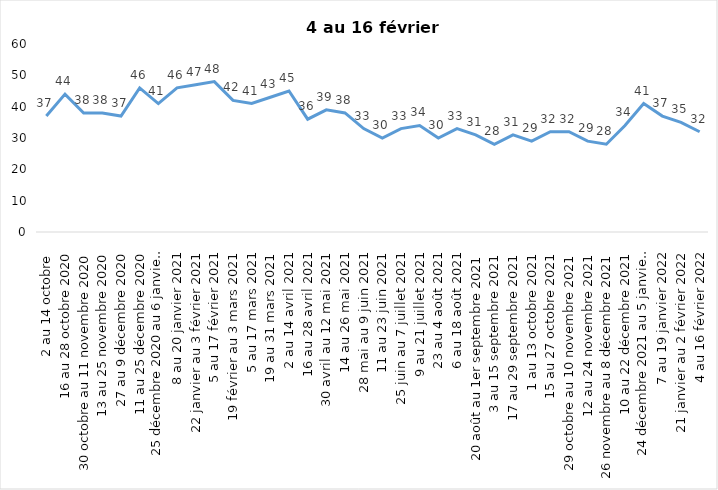
| Category | Toujours aux trois mesures |
|---|---|
| 2 au 14 octobre  | 37 |
| 16 au 28 octobre 2020 | 44 |
| 30 octobre au 11 novembre 2020 | 38 |
| 13 au 25 novembre 2020 | 38 |
| 27 au 9 décembre 2020 | 37 |
| 11 au 25 décembre 2020 | 46 |
| 25 décembre 2020 au 6 janvier 2021 | 41 |
| 8 au 20 janvier 2021 | 46 |
| 22 janvier au 3 février 2021 | 47 |
| 5 au 17 février 2021 | 48 |
| 19 février au 3 mars 2021 | 42 |
| 5 au 17 mars 2021 | 41 |
| 19 au 31 mars 2021 | 43 |
| 2 au 14 avril 2021 | 45 |
| 16 au 28 avril 2021 | 36 |
| 30 avril au 12 mai 2021 | 39 |
| 14 au 26 mai 2021 | 38 |
| 28 mai au 9 juin 2021 | 33 |
| 11 au 23 juin 2021 | 30 |
| 25 juin au 7 juillet 2021 | 33 |
| 9 au 21 juillet 2021 | 34 |
| 23 au 4 août 2021 | 30 |
| 6 au 18 août 2021 | 33 |
| 20 août au 1er septembre 2021 | 31 |
| 3 au 15 septembre 2021 | 28 |
| 17 au 29 septembre 2021 | 31 |
| 1 au 13 octobre 2021 | 29 |
| 15 au 27 octobre 2021 | 32 |
| 29 octobre au 10 novembre 2021 | 32 |
| 12 au 24 novembre 2021 | 29 |
| 26 novembre au 8 décembre 2021 | 28 |
| 10 au 22 décembre 2021 | 34 |
| 24 décembre 2021 au 5 janvier 2022 | 41 |
| 7 au 19 janvier 2022 | 37 |
| 21 janvier au 2 février 2022 | 35 |
| 4 au 16 février 2022 | 32 |